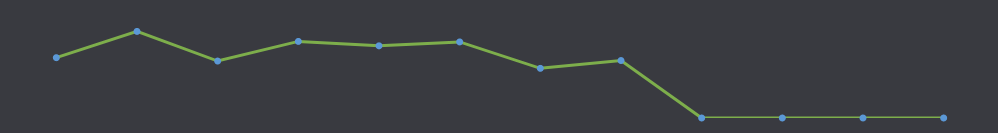
| Category | Mevcut Nakit |
|---|---|
| OCA | 820 |
| ŞUB | 1177 |
| MAR | 774 |
| NİS | 1041 |
| MAY | 981 |
| HAZ | 1034 |
| TEM | 675 |
| AĞU | 781 |
| EYL | 0 |
| EKİ | 0 |
| KAS | 0 |
| ARA | 0 |